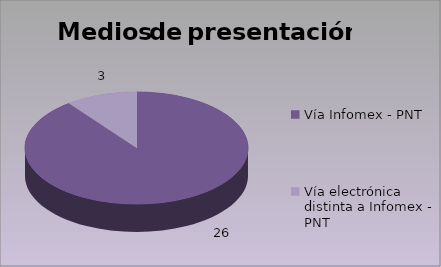
| Category | Series 0 |
|---|---|
| Vía Infomex - PNT | 26 |
| Vía electrónica distinta a Infomex - PNT | 3 |